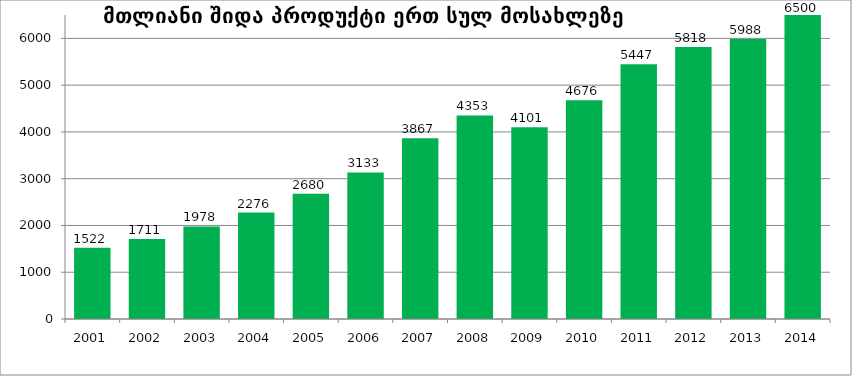
| Category | მთლიანი შიდა პროდუქტი ერთ სულ მოსახლეზე (ლარი) |
|---|---|
| 2001.0 | 1521.809 |
| 2002.0 | 1711.229 |
| 2003.0 | 1977.861 |
| 2004.0 | 2275.538 |
| 2005.0 | 2679.766 |
| 2006.0 | 3133.145 |
| 2007.0 | 3866.88 |
| 2008.0 | 4352.902 |
| 2009.0 | 4101.326 |
| 2010.0 | 4675.72 |
| 2011.0 | 5447.057 |
| 2012.0 | 5818.055 |
| 2013.0 | 5987.634 |
| 2014.0 | 6499.712 |